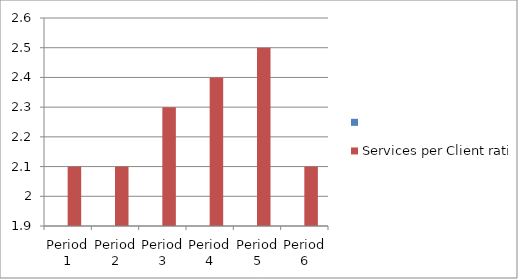
| Category | Series 0 | Services per Client ratio |
|---|---|---|
| Period 1 |  | 2.1 |
| Period 2 |  | 2.1 |
| Period 3 |  | 2.3 |
| Period 4 |  | 2.4 |
| Period 5 |  | 2.5 |
| Period 6 |  | 2.1 |